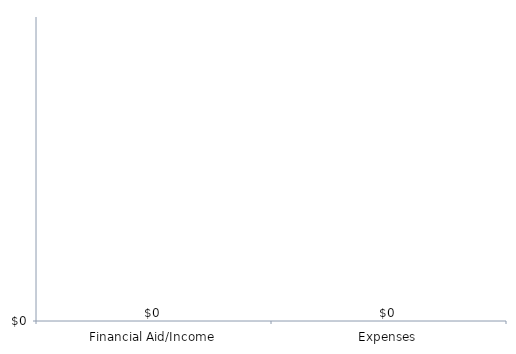
| Category | ChartData |
|---|---|
| 0 | 0 |
| 1 | 0 |